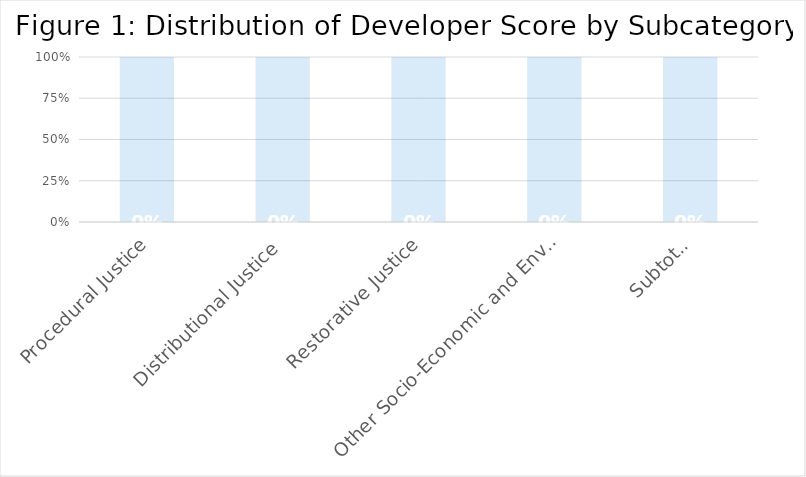
| Category | Series 0 | Series 1 |
|---|---|---|
| Procedural Justice | 0 | 1 |
| Distributional Justice | 0 | 1 |
| Restorative Justice | 0 | 1 |
| Other Socio-Economic and Environmental Factors | 0 | 1 |
| Subtotal | 0 | 1 |